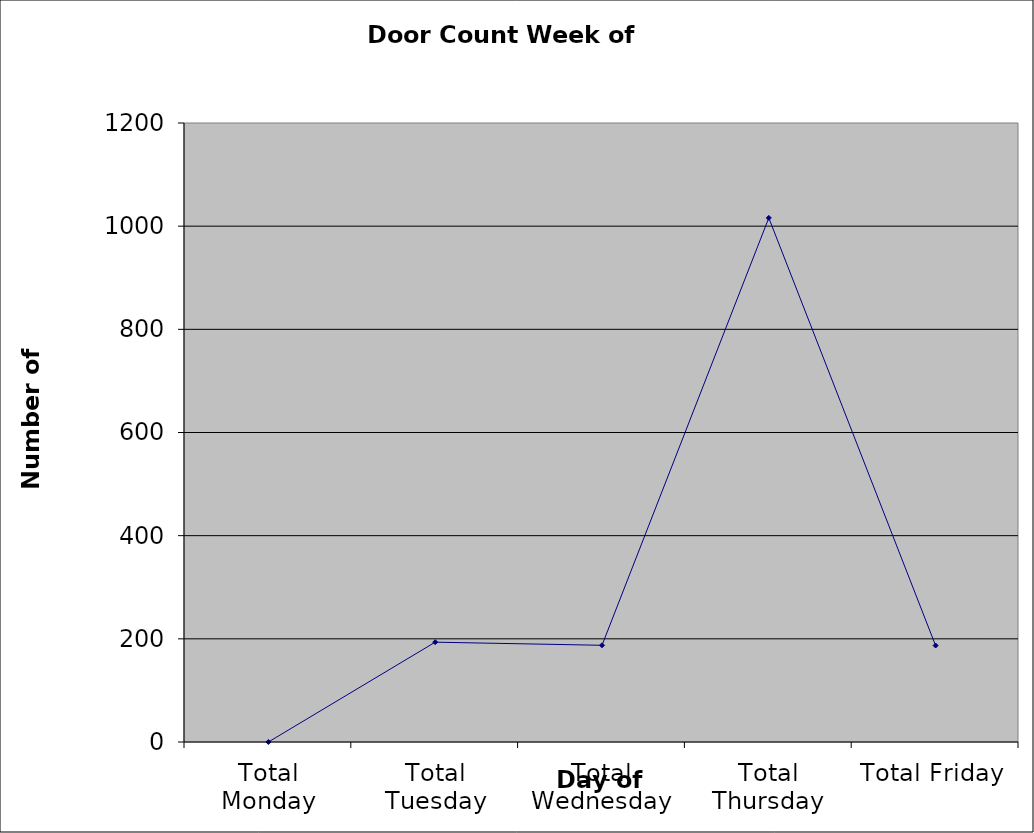
| Category | Series 0 |
|---|---|
| Total Monday | 0 |
| Total Tuesday | 193.5 |
| Total Wednesday | 187.5 |
| Total Thursday | 1016 |
| Total Friday | 187 |